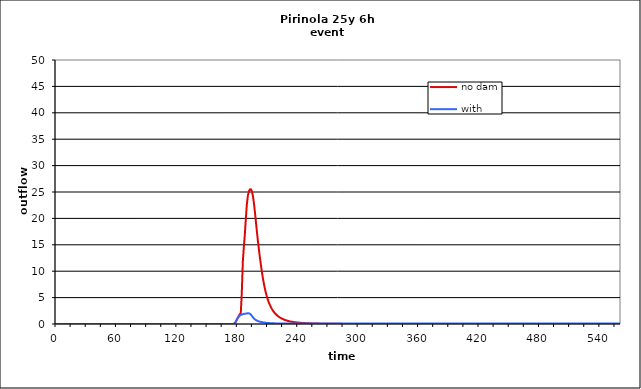
| Category | no dam | with dam |
|---|---|---|
| 0.0 | 0 | 0 |
| 1.0 | 0 | 0 |
| 2.0 | 0 | 0 |
| 3.0 | 0 | 0 |
| 4.0 | 0 | 0 |
| 5.0 | 0 | 0 |
| 6.0 | 0 | 0 |
| 7.0 | 0 | 0 |
| 8.0 | 0 | 0 |
| 9.0 | 0 | 0 |
| 10.0 | 0 | 0 |
| 11.0 | 0 | 0 |
| 12.0 | 0 | 0 |
| 13.0 | 0 | 0 |
| 14.0 | 0 | 0 |
| 15.0 | 0 | 0 |
| 16.0 | 0 | 0 |
| 17.0 | 0 | 0 |
| 18.0 | 0 | 0 |
| 19.0 | 0 | 0 |
| 20.0 | 0 | 0 |
| 21.0 | 0 | 0 |
| 22.0 | 0 | 0 |
| 23.0 | 0 | 0 |
| 24.0 | 0 | 0 |
| 25.0 | 0 | 0 |
| 26.0 | 0 | 0 |
| 27.0 | 0 | 0 |
| 28.0 | 0 | 0 |
| 29.0 | 0 | 0 |
| 30.0 | 0 | 0 |
| 31.0 | 0 | 0 |
| 32.0 | 0 | 0 |
| 33.0 | 0 | 0 |
| 34.0 | 0 | 0 |
| 35.0 | 0 | 0 |
| 36.0 | 0 | 0 |
| 37.0 | 0 | 0 |
| 38.0 | 0 | 0 |
| 39.0 | 0 | 0 |
| 40.0 | 0 | 0 |
| 41.0 | 0 | 0 |
| 42.0 | 0 | 0 |
| 43.0 | 0 | 0 |
| 44.0 | 0 | 0 |
| 45.0 | 0 | 0 |
| 46.0 | 0 | 0 |
| 47.0 | 0 | 0 |
| 48.0 | 0 | 0 |
| 49.0 | 0 | 0 |
| 50.0 | 0 | 0 |
| 51.0 | 0 | 0 |
| 52.0 | 0 | 0 |
| 53.0 | 0 | 0 |
| 54.0 | 0 | 0 |
| 55.0 | 0 | 0 |
| 56.0 | 0 | 0 |
| 57.0 | 0 | 0 |
| 58.0 | 0 | 0 |
| 59.0 | 0 | 0 |
| 60.0 | 0 | 0 |
| 61.0 | 0 | 0 |
| 62.0 | 0 | 0 |
| 63.0 | 0 | 0 |
| 64.0 | 0 | 0 |
| 65.0 | 0 | 0 |
| 66.0 | 0 | 0 |
| 67.0 | 0 | 0 |
| 68.0 | 0 | 0 |
| 69.0 | 0 | 0 |
| 70.0 | 0 | 0 |
| 71.0 | 0 | 0 |
| 72.0 | 0 | 0 |
| 73.0 | 0 | 0 |
| 74.0 | 0 | 0 |
| 75.0 | 0 | 0 |
| 76.0 | 0 | 0 |
| 77.0 | 0 | 0 |
| 78.0 | 0 | 0 |
| 79.0 | 0 | 0 |
| 80.0 | 0 | 0 |
| 81.0 | 0 | 0 |
| 82.0 | 0 | 0 |
| 83.0 | 0 | 0 |
| 84.0 | 0 | 0 |
| 85.0 | 0 | 0 |
| 86.0 | 0 | 0 |
| 87.0 | 0 | 0 |
| 88.0 | 0 | 0 |
| 89.0 | 0 | 0 |
| 90.0 | 0 | 0 |
| 91.0 | 0 | 0 |
| 92.0 | 0 | 0 |
| 93.0 | 0 | 0 |
| 94.0 | 0 | 0 |
| 95.0 | 0 | 0 |
| 96.0 | 0 | 0 |
| 97.0 | 0 | 0 |
| 98.0 | 0 | 0 |
| 99.0 | 0 | 0 |
| 100.0 | 0 | 0 |
| 101.0 | 0 | 0 |
| 102.0 | 0 | 0 |
| 103.0 | 0 | 0 |
| 104.0 | 0 | 0 |
| 105.0 | 0 | 0 |
| 106.0 | 0 | 0 |
| 107.0 | 0 | 0 |
| 108.0 | 0 | 0 |
| 109.0 | 0 | 0 |
| 110.0 | 0 | 0 |
| 111.0 | 0 | 0 |
| 112.0 | 0 | 0 |
| 113.0 | 0 | 0 |
| 114.0 | 0 | 0 |
| 115.0 | 0 | 0 |
| 116.0 | 0 | 0 |
| 117.0 | 0 | 0 |
| 118.0 | 0 | 0 |
| 119.0 | 0 | 0 |
| 120.0 | 0 | 0 |
| 121.0 | 0 | 0 |
| 122.0 | 0 | 0 |
| 123.0 | 0 | 0 |
| 124.0 | 0 | 0 |
| 125.0 | 0 | 0 |
| 126.0 | 0 | 0 |
| 127.0 | 0 | 0 |
| 128.0 | 0 | 0 |
| 129.0 | 0 | 0 |
| 130.0 | 0 | 0 |
| 131.0 | 0 | 0 |
| 132.0 | 0 | 0 |
| 133.0 | 0 | 0 |
| 134.0 | 0 | 0 |
| 135.0 | 0 | 0 |
| 136.0 | 0 | 0 |
| 137.0 | 0 | 0 |
| 138.0 | 0 | 0 |
| 139.0 | 0 | 0 |
| 140.0 | 0 | 0 |
| 141.0 | 0 | 0 |
| 142.0 | 0 | 0 |
| 143.0 | 0 | 0 |
| 144.0 | 0 | 0 |
| 145.0 | 0 | 0 |
| 146.0 | 0 | 0 |
| 147.0 | 0 | 0 |
| 148.0 | 0 | 0 |
| 149.0 | 0 | 0 |
| 150.0 | 0 | 0 |
| 151.0 | 0 | 0 |
| 152.0 | 0 | 0 |
| 153.0 | 0 | 0 |
| 154.0 | 0 | 0 |
| 155.0 | 0 | 0 |
| 156.0 | 0 | 0 |
| 157.0 | 0 | 0 |
| 158.0 | 0 | 0 |
| 159.0 | 0 | 0 |
| 160.0 | 0 | 0 |
| 161.0 | 0 | 0 |
| 162.0 | 0 | 0 |
| 163.0 | 0 | 0 |
| 164.0 | 0 | 0 |
| 165.0 | 0 | 0 |
| 166.0 | 0 | 0 |
| 167.0 | 0 | 0 |
| 168.0 | 0 | 0 |
| 169.0 | 0 | 0 |
| 170.0 | 0 | 0 |
| 171.0 | 0 | 0 |
| 172.0 | 0 | 0 |
| 173.0 | 0.002 | 0.002 |
| 174.0 | 0.007 | 0.007 |
| 175.0 | 0.017 | 0.017 |
| 176.0 | 0.036 | 0.036 |
| 177.0 | 0.094 | 0.089 |
| 178.0 | 0.427 | 0.407 |
| 179.0 | 0.827 | 0.793 |
| 180.0 | 1.178 | 1.117 |
| 181.0 | 1.515 | 1.386 |
| 182.0 | 1.843 | 1.584 |
| 183.0 | 2.078 | 1.711 |
| 184.0 | 6.077 | 1.797 |
| 185.0 | 11.772 | 1.859 |
| 186.0 | 14.544 | 1.905 |
| 187.0 | 16.976 | 1.943 |
| 188.0 | 19.985 | 1.976 |
| 189.0 | 22.646 | 2.005 |
| 190.0 | 24.27 | 2.033 |
| 191.0 | 25.133 | 2.031 |
| 192.0 | 25.493 | 1.942 |
| 193.0 | 25.505 | 1.77 |
| 194.0 | 25.117 | 1.529 |
| 195.0 | 24.281 | 1.275 |
| 196.0 | 22.94 | 1.058 |
| 197.0 | 21.212 | 0.885 |
| 198.0 | 19.324 | 0.749 |
| 199.0 | 17.452 | 0.641 |
| 200.0 | 15.702 | 0.557 |
| 201.0 | 14.067 | 0.489 |
| 202.0 | 12.546 | 0.434 |
| 203.0 | 11.112 | 0.387 |
| 204.0 | 9.794 | 0.348 |
| 205.0 | 8.606 | 0.313 |
| 206.0 | 7.547 | 0.283 |
| 207.0 | 6.622 | 0.256 |
| 208.0 | 5.816 | 0.232 |
| 209.0 | 5.119 | 0.21 |
| 210.0 | 4.515 | 0.192 |
| 211.0 | 3.993 | 0.176 |
| 212.0 | 3.543 | 0.163 |
| 213.0 | 3.15 | 0.151 |
| 214.0 | 2.809 | 0.142 |
| 215.0 | 2.509 | 0.133 |
| 216.0 | 2.247 | 0.126 |
| 217.0 | 2.013 | 0.119 |
| 218.0 | 1.808 | 0.114 |
| 219.0 | 1.629 | 0.109 |
| 220.0 | 1.471 | 0.105 |
| 221.0 | 1.33 | 0.102 |
| 222.0 | 1.206 | 0.099 |
| 223.0 | 1.096 | 0.097 |
| 224.0 | 0.997 | 0.095 |
| 225.0 | 0.909 | 0.093 |
| 226.0 | 0.83 | 0.092 |
| 227.0 | 0.758 | 0.091 |
| 228.0 | 0.693 | 0.09 |
| 229.0 | 0.633 | 0.089 |
| 230.0 | 0.58 | 0.088 |
| 231.0 | 0.532 | 0.088 |
| 232.0 | 0.489 | 0.087 |
| 233.0 | 0.451 | 0.087 |
| 234.0 | 0.417 | 0.086 |
| 235.0 | 0.386 | 0.086 |
| 236.0 | 0.358 | 0.086 |
| 237.0 | 0.332 | 0.086 |
| 238.0 | 0.309 | 0.086 |
| 239.0 | 0.287 | 0.085 |
| 240.0 | 0.267 | 0.085 |
| 241.0 | 0.249 | 0.085 |
| 242.0 | 0.232 | 0.085 |
| 243.0 | 0.217 | 0.085 |
| 244.0 | 0.202 | 0.085 |
| 245.0 | 0.189 | 0.085 |
| 246.0 | 0.177 | 0.085 |
| 247.0 | 0.165 | 0.085 |
| 248.0 | 0.155 | 0.085 |
| 249.0 | 0.145 | 0.085 |
| 250.0 | 0.136 | 0.085 |
| 251.0 | 0.128 | 0.084 |
| 252.0 | 0.12 | 0.084 |
| 253.0 | 0.113 | 0.084 |
| 254.0 | 0.107 | 0.084 |
| 255.0 | 0.1 | 0.084 |
| 256.0 | 0.095 | 0.084 |
| 257.0 | 0.089 | 0.084 |
| 258.0 | 0.084 | 0.084 |
| 259.0 | 0.08 | 0.084 |
| 260.0 | 0.075 | 0.084 |
| 261.0 | 0.071 | 0.084 |
| 262.0 | 0.067 | 0.084 |
| 263.0 | 0.064 | 0.084 |
| 264.0 | 0.06 | 0.084 |
| 265.0 | 0.057 | 0.084 |
| 266.0 | 0.054 | 0.084 |
| 267.0 | 0.051 | 0.085 |
| 268.0 | 0.049 | 0.085 |
| 269.0 | 0.046 | 0.085 |
| 270.0 | 0.044 | 0.085 |
| 271.0 | 0.042 | 0.085 |
| 272.0 | 0.04 | 0.085 |
| 273.0 | 0.038 | 0.085 |
| 274.0 | 0.036 | 0.085 |
| 275.0 | 0.034 | 0.085 |
| 276.0 | 0.032 | 0.085 |
| 277.0 | 0.031 | 0.085 |
| 278.0 | 0.029 | 0.085 |
| 279.0 | 0.028 | 0.085 |
| 280.0 | 0.027 | 0.085 |
| 281.0 | 0.025 | 0.085 |
| 282.0 | 0.024 | 0.085 |
| 283.0 | 0.023 | 0.085 |
| 284.0 | 0.022 | 0.085 |
| 285.0 | 0.021 | 0.085 |
| 286.0 | 0.02 | 0.085 |
| 287.0 | 0.019 | 0.085 |
| 288.0 | 0.018 | 0.085 |
| 289.0 | 0.018 | 0.085 |
| 290.0 | 0.017 | 0.085 |
| 291.0 | 0.016 | 0.085 |
| 292.0 | 0.015 | 0.085 |
| 293.0 | 0.015 | 0.085 |
| 294.0 | 0.014 | 0.085 |
| 295.0 | 0.014 | 0.085 |
| 296.0 | 0.013 | 0.085 |
| 297.0 | 0.013 | 0.085 |
| 298.0 | 0.012 | 0.085 |
| 299.0 | 0.012 | 0.085 |
| 300.0 | 0.011 | 0.085 |
| 301.0 | 0.011 | 0.085 |
| 302.0 | 0.01 | 0.085 |
| 303.0 | 0.01 | 0.085 |
| 304.0 | 0.009 | 0.085 |
| 305.0 | 0.009 | 0.085 |
| 306.0 | 0.008 | 0.085 |
| 307.0 | 0.008 | 0.085 |
| 308.0 | 0.008 | 0.085 |
| 309.0 | 0.007 | 0.085 |
| 310.0 | 0.007 | 0.085 |
| 311.0 | 0.007 | 0.084 |
| 312.0 | 0.006 | 0.084 |
| 313.0 | 0.006 | 0.084 |
| 314.0 | 0.006 | 0.084 |
| 315.0 | 0.005 | 0.084 |
| 316.0 | 0.005 | 0.084 |
| 317.0 | 0.005 | 0.084 |
| 318.0 | 0.005 | 0.084 |
| 319.0 | 0.004 | 0.084 |
| 320.0 | 0.004 | 0.084 |
| 321.0 | 0.004 | 0.084 |
| 322.0 | 0.004 | 0.084 |
| 323.0 | 0.004 | 0.084 |
| 324.0 | 0.003 | 0.084 |
| 325.0 | 0.003 | 0.084 |
| 326.0 | 0.003 | 0.084 |
| 327.0 | 0.003 | 0.084 |
| 328.0 | 0.003 | 0.084 |
| 329.0 | 0.003 | 0.084 |
| 330.0 | 0.002 | 0.084 |
| 331.0 | 0.002 | 0.084 |
| 332.0 | 0.002 | 0.084 |
| 333.0 | 0.002 | 0.084 |
| 334.0 | 0.002 | 0.084 |
| 335.0 | 0.002 | 0.084 |
| 336.0 | 0.002 | 0.084 |
| 337.0 | 0.002 | 0.084 |
| 338.0 | 0.001 | 0.084 |
| 339.0 | 0.001 | 0.084 |
| 340.0 | 0.001 | 0.084 |
| 341.0 | 0.001 | 0.084 |
| 342.0 | 0.001 | 0.084 |
| 343.0 | 0.001 | 0.084 |
| 344.0 | 0.001 | 0.084 |
| 345.0 | 0.001 | 0.084 |
| 346.0 | 0.001 | 0.084 |
| 347.0 | 0.001 | 0.084 |
| 348.0 | 0.001 | 0.084 |
| 349.0 | 0.001 | 0.084 |
| 350.0 | 0.001 | 0.084 |
| 351.0 | 0.001 | 0.084 |
| 352.0 | 0.001 | 0.084 |
| 353.0 | 0.001 | 0.084 |
| 354.0 | 0 | 0.084 |
| 355.0 | 0 | 0.084 |
| 356.0 | 0 | 0.084 |
| 357.0 | 0 | 0.084 |
| 358.0 | 0 | 0.084 |
| 359.0 | 0 | 0.084 |
| 360.0 | 0 | 0.084 |
| 361.0 | 0 | 0.084 |
| 362.0 | 0 | 0.084 |
| 363.0 | 0 | 0.084 |
| 364.0 | 0 | 0.084 |
| 365.0 | 0 | 0.084 |
| 366.0 | 0 | 0.084 |
| 367.0 | 0 | 0.084 |
| 368.0 | 0 | 0.084 |
| 369.0 | 0 | 0.084 |
| 370.0 | 0 | 0.084 |
| 371.0 | 0 | 0.084 |
| 372.0 | 0 | 0.084 |
| 373.0 | 0 | 0.084 |
| 374.0 | 0 | 0.084 |
| 375.0 | 0 | 0.084 |
| 376.0 | 0 | 0.084 |
| 377.0 | 0 | 0.084 |
| 378.0 | 0 | 0.084 |
| 379.0 | 0 | 0.084 |
| 380.0 | 0 | 0.084 |
| 381.0 | 0 | 0.084 |
| 382.0 | 0 | 0.084 |
| 383.0 | 0 | 0.084 |
| 384.0 | 0 | 0.084 |
| 385.0 | 0 | 0.084 |
| 386.0 | 0 | 0.084 |
| 387.0 | 0 | 0.084 |
| 388.0 | 0 | 0.084 |
| 389.0 | 0 | 0.084 |
| 390.0 | 0 | 0.084 |
| 391.0 | 0 | 0.084 |
| 392.0 | 0 | 0.084 |
| 393.0 | 0 | 0.084 |
| 394.0 | 0 | 0.084 |
| 395.0 | 0 | 0.084 |
| 396.0 | 0 | 0.084 |
| 397.0 | 0 | 0.084 |
| 398.0 | 0 | 0.084 |
| 399.0 | 0 | 0.084 |
| 400.0 | 0 | 0.084 |
| 401.0 | 0 | 0.084 |
| 402.0 | 0 | 0.084 |
| 403.0 | 0 | 0.084 |
| 404.0 | 0 | 0.084 |
| 405.0 | 0 | 0.084 |
| 406.0 | 0 | 0.084 |
| 407.0 | 0 | 0.084 |
| 408.0 | 0 | 0.084 |
| 409.0 | 0 | 0.084 |
| 410.0 | 0 | 0.084 |
| 411.0 | 0 | 0.084 |
| 412.0 | 0 | 0.084 |
| 413.0 | 0 | 0.084 |
| 414.0 | 0 | 0.084 |
| 415.0 | 0 | 0.084 |
| 416.0 | 0 | 0.084 |
| 417.0 | 0 | 0.084 |
| 418.0 | 0 | 0.084 |
| 419.0 | 0 | 0.084 |
| 420.0 | 0 | 0.084 |
| 421.0 | 0 | 0.083 |
| 422.0 | 0 | 0.083 |
| 423.0 | 0 | 0.083 |
| 424.0 | 0 | 0.083 |
| 425.0 | 0 | 0.083 |
| 426.0 | 0 | 0.083 |
| 427.0 | 0 | 0.083 |
| 428.0 | 0 | 0.083 |
| 429.0 | 0 | 0.083 |
| 430.0 | 0 | 0.083 |
| 431.0 | 0 | 0.083 |
| 432.0 | 0 | 0.083 |
| 433.0 | 0 | 0.083 |
| 434.0 | 0 | 0.083 |
| 435.0 | 0 | 0.083 |
| 436.0 | 0 | 0.083 |
| 437.0 | 0 | 0.083 |
| 438.0 | 0 | 0.083 |
| 439.0 | 0 | 0.083 |
| 440.0 | 0 | 0.083 |
| 441.0 | 0 | 0.083 |
| 442.0 | 0 | 0.083 |
| 443.0 | 0 | 0.083 |
| 444.0 | 0 | 0.083 |
| 445.0 | 0 | 0.083 |
| 446.0 | 0 | 0.083 |
| 447.0 | 0 | 0.083 |
| 448.0 | 0 | 0.083 |
| 449.0 | 0 | 0.083 |
| 450.0 | 0 | 0.083 |
| 451.0 | 0 | 0.083 |
| 452.0 | 0 | 0.083 |
| 453.0 | 0 | 0.083 |
| 454.0 | 0 | 0.083 |
| 455.0 | 0 | 0.083 |
| 456.0 | 0 | 0.083 |
| 457.0 | 0 | 0.083 |
| 458.0 | 0 | 0.083 |
| 459.0 | 0 | 0.083 |
| 460.0 | 0 | 0.083 |
| 461.0 | 0 | 0.083 |
| 462.0 | 0 | 0.083 |
| 463.0 | 0 | 0.083 |
| 464.0 | 0 | 0.083 |
| 465.0 | 0 | 0.083 |
| 466.0 | 0 | 0.083 |
| 467.0 | 0 | 0.083 |
| 468.0 | 0 | 0.083 |
| 469.0 | 0 | 0.083 |
| 470.0 | 0 | 0.083 |
| 471.0 | 0 | 0.083 |
| 472.0 | 0 | 0.083 |
| 473.0 | 0 | 0.083 |
| 474.0 | 0 | 0.083 |
| 475.0 | 0 | 0.083 |
| 476.0 | 0 | 0.083 |
| 477.0 | 0 | 0.083 |
| 478.0 | 0 | 0.083 |
| 479.0 | 0 | 0.083 |
| 480.0 | 0 | 0.083 |
| 481.0 | 0 | 0.083 |
| 482.0 | 0 | 0.083 |
| 483.0 | 0 | 0.083 |
| 484.0 | 0 | 0.083 |
| 485.0 | 0 | 0.083 |
| 486.0 | 0 | 0.083 |
| 487.0 | 0 | 0.083 |
| 488.0 | 0 | 0.083 |
| 489.0 | 0 | 0.083 |
| 490.0 | 0 | 0.083 |
| 491.0 | 0 | 0.083 |
| 492.0 | 0 | 0.083 |
| 493.0 | 0 | 0.083 |
| 494.0 | 0 | 0.083 |
| 495.0 | 0 | 0.083 |
| 496.0 | 0 | 0.083 |
| 497.0 | 0 | 0.083 |
| 498.0 | 0 | 0.083 |
| 499.0 | 0 | 0.083 |
| 500.0 | 0 | 0.083 |
| 501.0 | 0 | 0.083 |
| 502.0 | 0 | 0.083 |
| 503.0 | 0 | 0.083 |
| 504.0 | 0 | 0.083 |
| 505.0 | 0 | 0.083 |
| 506.0 | 0 | 0.083 |
| 507.0 | 0 | 0.082 |
| 508.0 | 0 | 0.082 |
| 509.0 | 0 | 0.082 |
| 510.0 | 0 | 0.082 |
| 511.0 | 0 | 0.082 |
| 512.0 | 0 | 0.082 |
| 513.0 | 0 | 0.082 |
| 514.0 | 0 | 0.082 |
| 515.0 | 0 | 0.082 |
| 516.0 | 0 | 0.082 |
| 517.0 | 0 | 0.082 |
| 518.0 | 0 | 0.082 |
| 519.0 | 0 | 0.082 |
| 520.0 | 0 | 0.082 |
| 521.0 | 0 | 0.082 |
| 522.0 | 0 | 0.082 |
| 523.0 | 0 | 0.082 |
| 524.0 | 0 | 0.082 |
| 525.0 | 0 | 0.082 |
| 526.0 | 0 | 0.082 |
| 527.0 | 0 | 0.082 |
| 528.0 | 0 | 0.082 |
| 529.0 | 0 | 0.082 |
| 530.0 | 0 | 0.082 |
| 531.0 | 0 | 0.082 |
| 532.0 | 0 | 0.082 |
| 533.0 | 0 | 0.082 |
| 534.0 | 0 | 0.082 |
| 535.0 | 0 | 0.082 |
| 536.0 | 0 | 0.082 |
| 537.0 | 0 | 0.082 |
| 538.0 | 0 | 0.082 |
| 539.0 | 0 | 0.082 |
| 540.0 | 0 | 0.082 |
| 541.0 | 0 | 0.082 |
| 542.0 | 0 | 0.082 |
| 543.0 | 0 | 0.082 |
| 544.0 | 0 | 0.082 |
| 545.0 | 0 | 0.082 |
| 546.0 | 0 | 0.082 |
| 547.0 | 0 | 0.082 |
| 548.0 | 0 | 0.082 |
| 549.0 | 0 | 0.082 |
| 550.0 | 0 | 0.082 |
| 551.0 | 0 | 0.082 |
| 552.0 | 0 | 0.082 |
| 553.0 | 0 | 0.082 |
| 554.0 | 0 | 0.082 |
| 555.0 | 0 | 0.082 |
| 556.0 | 0 | 0.082 |
| 557.0 | 0 | 0.082 |
| 558.0 | 0 | 0.082 |
| 559.0 | 0 | 0.082 |
| 560.0 | 0 | 0.082 |